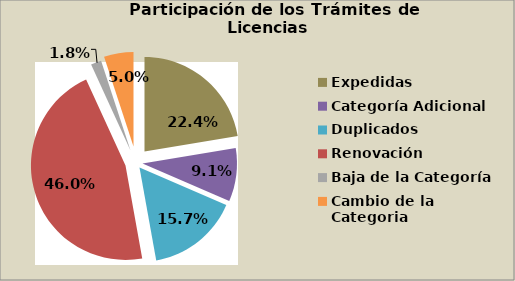
| Category | Series 0 |
|---|---|
| Expedidas | 22.373 |
| Categoría Adicional | 9.101 |
| Duplicados | 15.689 |
| Renovación | 45.992 |
| Baja de la Categoría | 1.804 |
| Cambio de la Categoria | 5.04 |